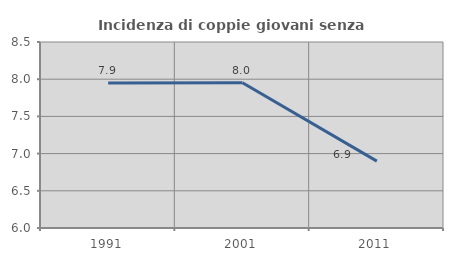
| Category | Incidenza di coppie giovani senza figli |
|---|---|
| 1991.0 | 7.948 |
| 2001.0 | 7.953 |
| 2011.0 | 6.898 |